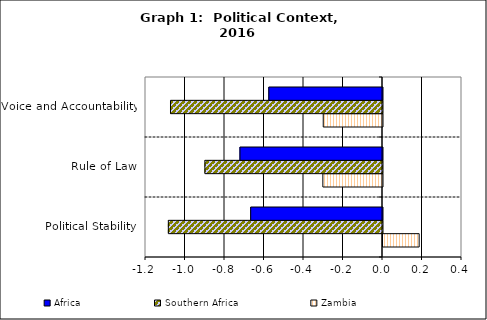
| Category | Zambia | Southern Africa | Africa |
|---|---|---|---|
| Political Stability | 0.183 | -1.084 | -0.667 |
| Rule of Law | -0.302 | -0.899 | -0.722 |
| Voice and Accountability | -0.3 | -1.073 | -0.576 |